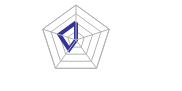
| Category | Series 0 |
|---|---|
| 0 | 2 |
| 1 | 0 |
| 2 | 0 |
| 3 | 1.33 |
| 4 | 2 |